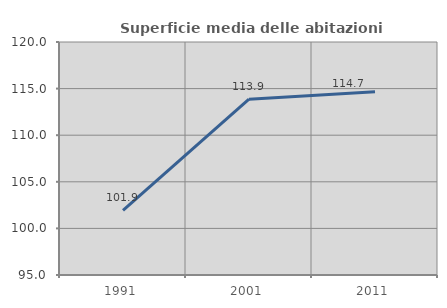
| Category | Superficie media delle abitazioni occupate |
|---|---|
| 1991.0 | 101.922 |
| 2001.0 | 113.861 |
| 2011.0 | 114.656 |